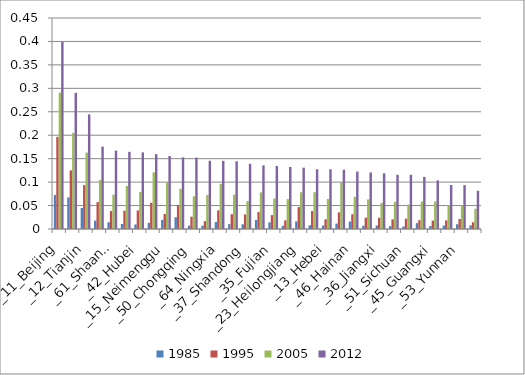
| Category | 1985 | 1995 | 2005 | 2012 |
|---|---|---|---|---|
| _11_Beijing | 0.073 | 0.197 | 0.291 | 0.399 |
| _31_Shanghai | 0.067 | 0.125 | 0.205 | 0.29 |
| _12_Tianjin | 0.045 | 0.094 | 0.163 | 0.244 |
| _21_Liaoning | 0.018 | 0.057 | 0.105 | 0.176 |
| _61_Shaanxi | 0.014 | 0.038 | 0.073 | 0.167 |
| _32_Jiangsu | 0.011 | 0.039 | 0.092 | 0.165 |
| _42_Hubei | 0.01 | 0.04 | 0.079 | 0.163 |
| _65_Xinjiang | 0.013 | 0.056 | 0.121 | 0.16 |
| _15_Neimenggu | 0.019 | 0.032 | 0.099 | 0.156 |
| _22_Jilin | 0.025 | 0.051 | 0.086 | 0.153 |
| _50_Chongqing | 0.007 | 0.026 | 0.07 | 0.152 |
| _33_Zhejiang | 0.007 | 0.017 | 0.073 | 0.146 |
| _64_Ningxia | 0.015 | 0.04 | 0.096 | 0.145 |
| _0_quanguo | 0.01 | 0.031 | 0.073 | 0.144 |
| _37_Shandong | 0.01 | 0.031 | 0.06 | 0.139 |
| _14_Shanxi | 0.019 | 0.036 | 0.078 | 0.136 |
| _35_Fujian | 0.014 | 0.03 | 0.065 | 0.134 |
| _43_Hunan | 0.007 | 0.019 | 0.064 | 0.132 |
| _23_Heilongjiang | 0.016 | 0.047 | 0.078 | 0.131 |
| _44_Guangdong | 0.008 | 0.039 | 0.078 | 0.127 |
| _13_Hebei | 0.007 | 0.021 | 0.064 | 0.127 |
| _63_Qinghai | 0.011 | 0.035 | 0.099 | 0.126 |
| _46_Hainan | 0.016 | 0.031 | 0.069 | 0.123 |
| _62_Gansu | 0.007 | 0.024 | 0.063 | 0.121 |
| _36_Jiangxi | 0.007 | 0.024 | 0.056 | 0.119 |
| _34_Anhui | 0.006 | 0.021 | 0.058 | 0.116 |
| _51_Sichuan | 0.005 | 0.022 | 0.052 | 0.116 |
| _41_Henan | 0.013 | 0.019 | 0.058 | 0.111 |
| _45_Guangxi | 0.006 | 0.018 | 0.059 | 0.104 |
| _52_Guizhou | 0.007 | 0.018 | 0.051 | 0.094 |
| _53_Yunnan | 0.01 | 0.021 | 0.051 | 0.094 |
| _54_Xizang | 0.008 | 0.014 | 0.043 | 0.082 |